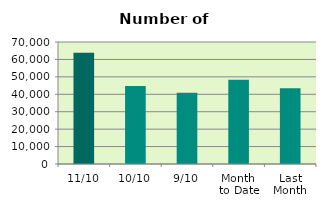
| Category | Series 0 |
|---|---|
| 11/10 | 63784 |
| 10/10 | 44802 |
| 9/10 | 40826 |
| Month 
to Date | 48343.556 |
| Last
Month | 43452.667 |